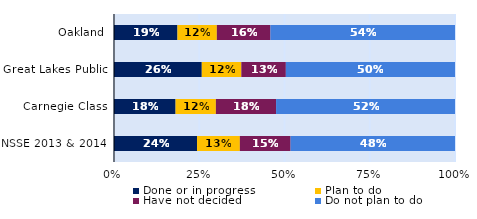
| Category | Done or in progress | Plan to do | Have not decided | Do not plan to do |
|---|---|---|---|---|
| Oakland | 0.186 | 0.116 | 0.157 | 0.541 |
| Great Lakes Public | 0.257 | 0.116 | 0.131 | 0.496 |
| Carnegie Class | 0.181 | 0.118 | 0.177 | 0.525 |
| NSSE 2013 & 2014 | 0.244 | 0.126 | 0.149 | 0.482 |